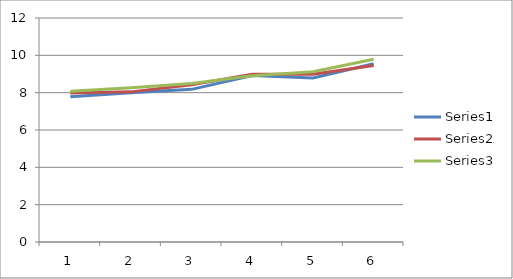
| Category | Series 0 | Series 1 | Series 2 |
|---|---|---|---|
| 0 | 7.787 | 7.98 | 8.074 |
| 1 | 8 | 8.043 | 8.257 |
| 2 | 8.176 | 8.424 | 8.487 |
| 3 | 8.916 | 8.982 | 8.911 |
| 4 | 8.79 | 8.985 | 9.124 |
| 5 | 9.545 | 9.455 | 9.79 |